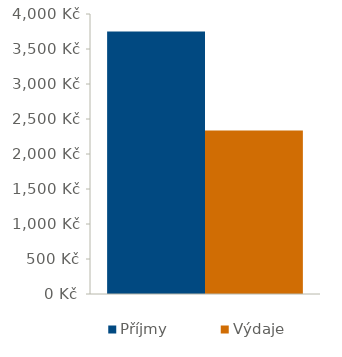
| Category | Příjmy | Výdaje |
|---|---|---|
| 0 | 3750 | 2336 |